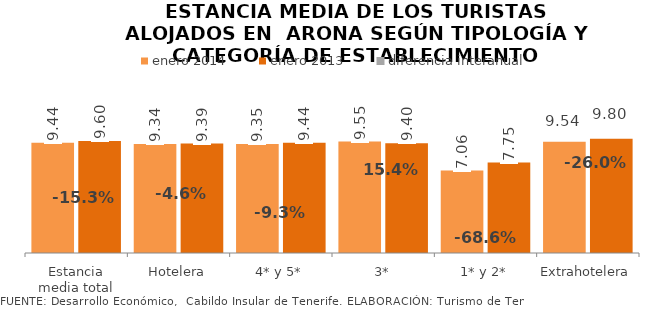
| Category | enero 2014 | enero 2013 |
|---|---|---|
| Estancia media total | 9.443 | 9.596 |
| Hotelera | 9.339 | 9.385 |
| 4* y 5* | 9.35 | 9.444 |
| 3* | 9.554 | 9.401 |
| 1* y 2* | 7.061 | 7.747 |
| Extrahotelera | 9.54 | 9.8 |